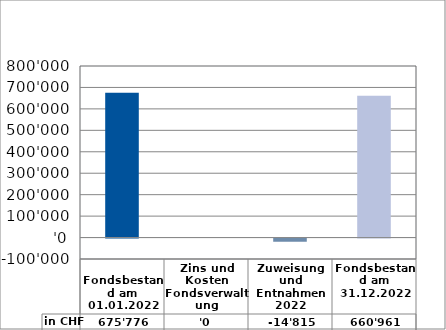
| Category | in CHF |
|---|---|
| 
Fondsbestand am 01.01.2022

 | 675776.05 |
| Zins und Kosten Fondsverwaltung | 0 |
| Zuweisung und Entnahmen 2022 | -14815 |
| Fondsbestand am 31.12.2022 | 660961.05 |